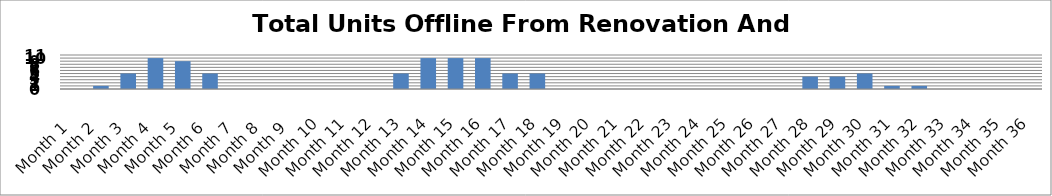
| Category | Series 0 |
|---|---|
| 1.0 | 0 |
| 2.0 | 1 |
| 3.0 | 5 |
| 4.0 | 10 |
| 5.0 | 9 |
| 6.0 | 5 |
| 7.0 | 0 |
| 8.0 | 0 |
| 9.0 | 0 |
| 10.0 | 0 |
| 11.0 | 0 |
| 12.0 | 0 |
| 13.0 | 5 |
| 14.0 | 10 |
| 15.0 | 10 |
| 16.0 | 10 |
| 17.0 | 5 |
| 18.0 | 5 |
| 19.0 | 0 |
| 20.0 | 0 |
| 21.0 | 0 |
| 22.0 | 0 |
| 23.0 | 0 |
| 24.0 | 0 |
| 25.0 | 0 |
| 26.0 | 0 |
| 27.0 | 0 |
| 28.0 | 4 |
| 29.0 | 4 |
| 30.0 | 5 |
| 31.0 | 1 |
| 32.0 | 1 |
| 33.0 | 0 |
| 34.0 | 0 |
| 35.0 | 0 |
| 36.0 | 0 |